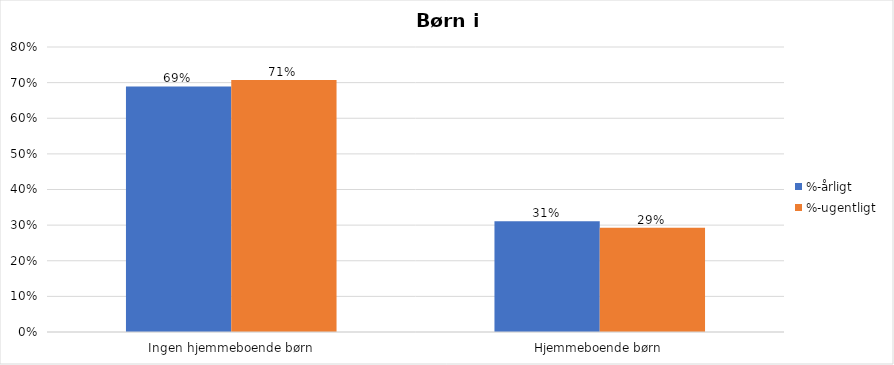
| Category | %-årligt | %-ugentligt |
|---|---|---|
| Ingen hjemmeboende børn | 0.689 | 0.707 |
| Hjemmeboende børn | 0.311 | 0.293 |